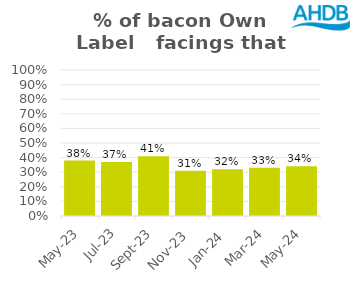
| Category | Bacon |
|---|---|
| 2023-05-01 | 0.38 |
| 2023-07-01 | 0.37 |
| 2023-09-01 | 0.41 |
| 2023-11-01 | 0.31 |
| 2024-01-01 | 0.32 |
| 2024-03-01 | 0.33 |
| 2024-05-01 | 0.34 |